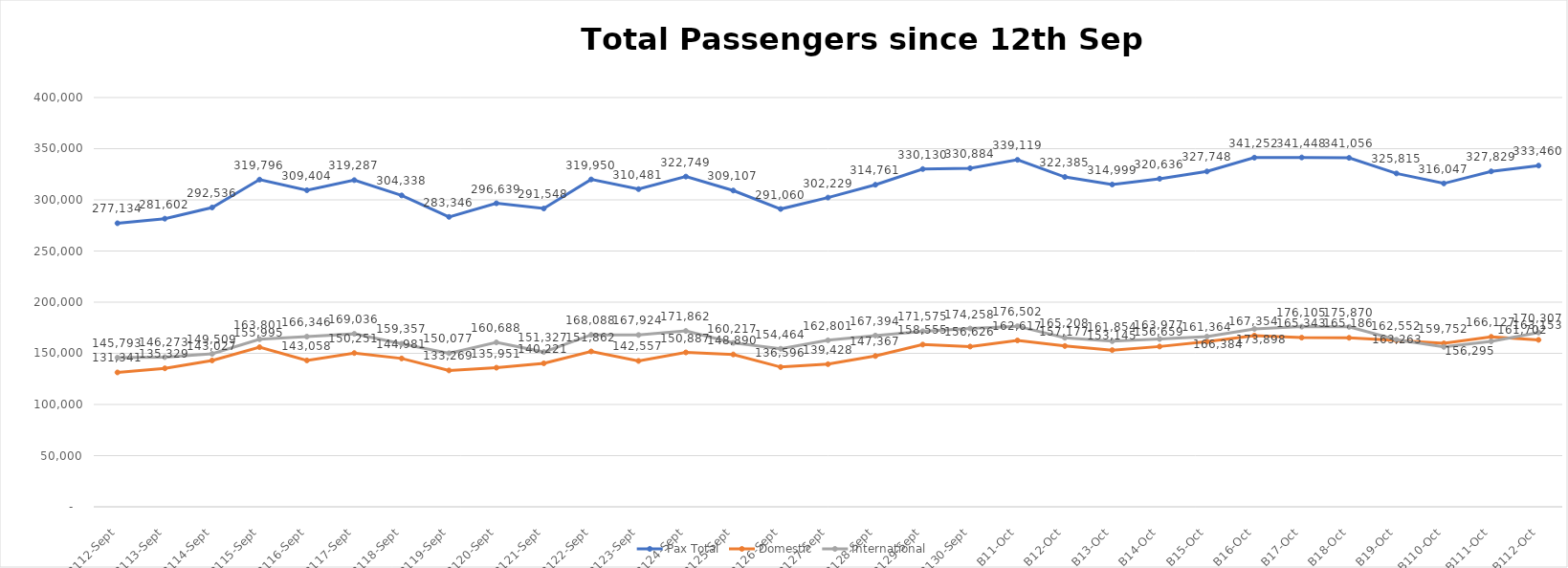
| Category | Pax Total | Domestic | International |
|---|---|---|---|
| 2023-09-12 | 277134 | 131341 | 145793 |
| 2023-09-13 | 281602 | 135329 | 146273 |
| 2023-09-14 | 292536 | 143027 | 149509 |
| 2023-09-15 | 319796 | 155995 | 163801 |
| 2023-09-16 | 309404 | 143058 | 166346 |
| 2023-09-17 | 319287 | 150251 | 169036 |
| 2023-09-18 | 304338 | 144981 | 159357 |
| 2023-09-19 | 283346 | 133269 | 150077 |
| 2023-09-20 | 296639 | 135951 | 160688 |
| 2023-09-21 | 291548 | 140221 | 151327 |
| 2023-09-22 | 319950 | 151862 | 168088 |
| 2023-09-23 | 310481 | 142557 | 167924 |
| 2023-09-24 | 322749 | 150887 | 171862 |
| 2023-09-25 | 309107 | 148890 | 160217 |
| 2023-09-26 | 291060 | 136596 | 154464 |
| 2023-09-27 | 302229 | 139428 | 162801 |
| 2023-09-28 | 314761 | 147367 | 167394 |
| 2023-09-29 | 330130 | 158555 | 171575 |
| 2023-09-30 | 330884 | 156626 | 174258 |
| 2023-10-01 | 339119 | 162617 | 176502 |
| 2023-10-02 | 322385 | 157177 | 165208 |
| 2023-10-03 | 314999 | 153145 | 161854 |
| 2023-10-04 | 320636 | 156659 | 163977 |
| 2023-10-05 | 327748 | 161364 | 166384 |
| 2023-10-06 | 341252 | 167354 | 173898 |
| 2023-10-07 | 341448 | 165343 | 176105 |
| 2023-10-08 | 341056 | 165186 | 175870 |
| 2023-10-09 | 325815 | 162552 | 163263 |
| 2023-10-10 | 316047 | 159752 | 156295 |
| 2023-10-11 | 327829 | 166127 | 161702 |
| 2023-10-12 | 333460 | 163153 | 170307 |